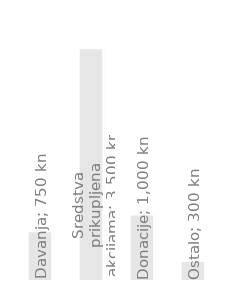
| Category | Godišnji prihod |
|---|---|
| Davanja | 750 |
| Sredstva prikupljena akcijama | 3500 |
| Donacije | 1000 |
| Ostalo | 300 |